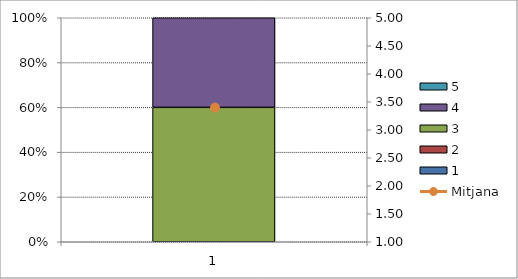
| Category | 1 | 2 | 3 | 4 | 5 |
|---|---|---|---|---|---|
| 0 | 0 | 0 | 3 | 2 | 0 |